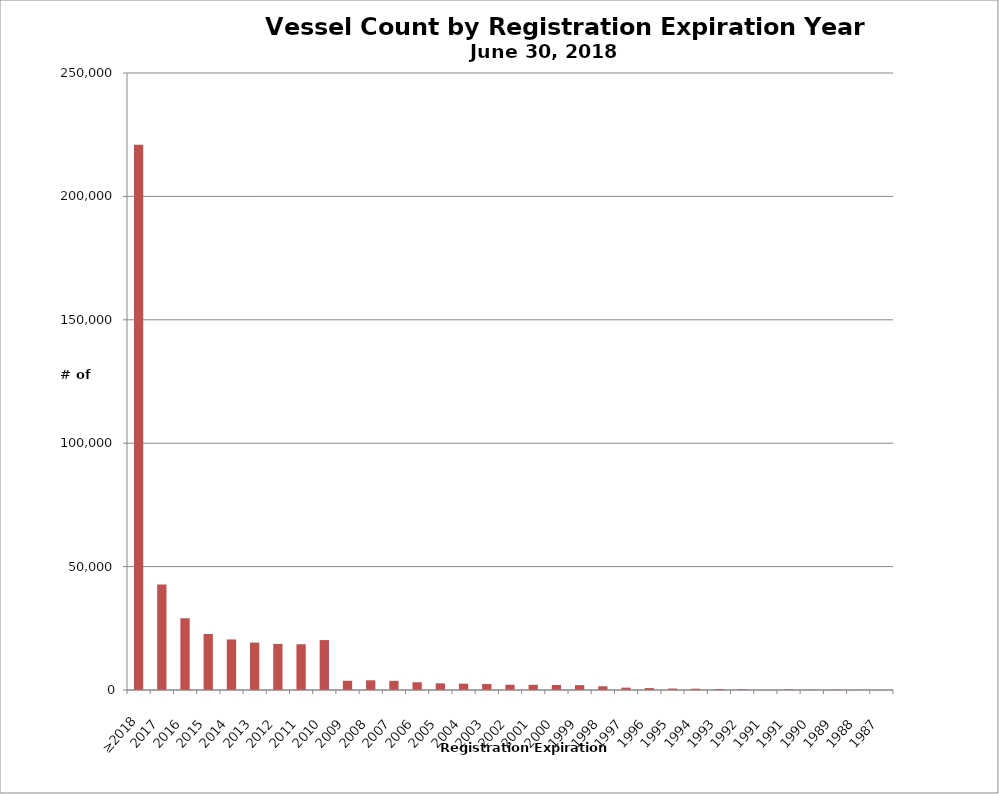
| Category | Count |
|---|---|
| ≥2018 | 220908 |
| 2017 | 42703 |
| 2016 | 29082 |
| 2015 | 22719 |
| 2014 | 20487 |
| 2013 | 19215 |
| 2012 | 18687 |
| 2011 | 18543 |
| 2010 | 20231 |
| 2009 | 3739 |
| 2008 | 3929 |
| 2007 | 3713 |
| 2006 | 3144 |
| 2005 | 2698 |
| 2004 | 2565 |
| 2003 | 2450 |
| 2002 | 2137 |
| 2001 | 2117 |
| 2000 | 2044 |
| 1999 | 1983 |
| 1998 | 1516 |
| 1997 | 958 |
| 1996 | 778 |
| 1995 | 586 |
| 1994 | 530 |
| 1993 | 394 |
| 1992 | 318 |
| 1991 | 1 |
| 1991 | 244 |
| 1990 | 117 |
| 1989 | 129 |
| 1988 | 92 |
| 1987 | 60 |